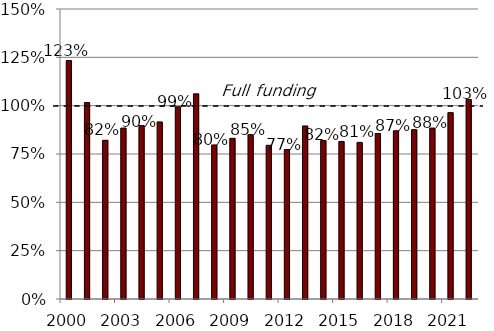
| Category | Series 1 |
|---|---|
| 2000.0 | 1.233 |
| 2001.0 | 1.016 |
| 2002.0 | 0.821 |
| 2003.0 | 0.884 |
| 2004.0 | 0.897 |
| 2005.0 | 0.916 |
| 2006.0 | 0.994 |
| 2007.0 | 1.061 |
| 2008.0 | 0.797 |
| 2009.0 | 0.831 |
| 2010.0 | 0.85 |
| 2011.0 | 0.795 |
| 2012.0 | 0.773 |
| 2013.0 | 0.895 |
| 2014.0 | 0.82 |
| 2015.0 | 0.815 |
| 2016.0 | 0.81 |
| 2017.0 | 0.856 |
| 2018.0 | 0.87 |
| 2019.0 | 0.876 |
| 2020.0 | 0.884 |
| 2021.0 | 0.964 |
| 2022.0 | 1.032 |